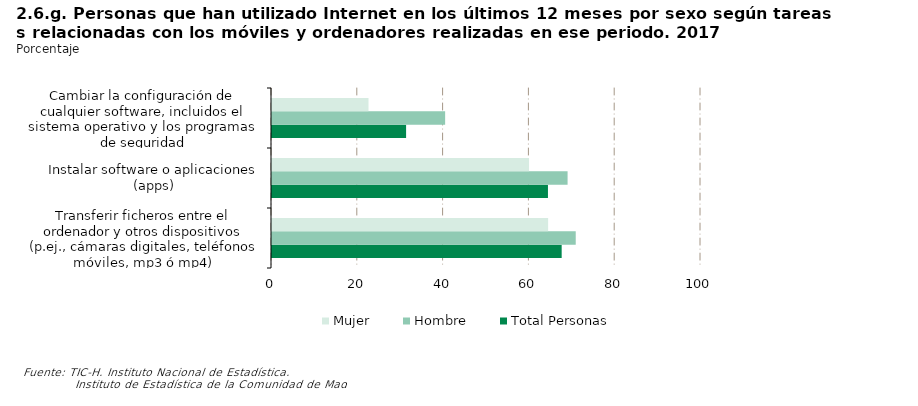
| Category | Total Personas | Hombre | Mujer |
|---|---|---|---|
| Transferir ficheros entre el ordenador y otros dispositivos (p.ej., cámaras digitales, teléfonos móviles, mp3 ó mp4) | 67.522 | 70.799 | 64.366 |
| Instalar software o aplicaciones (apps) | 64.325 | 68.9 | 59.92 |
| Cambiar la configuración de cualquier software, incluidos el sistema operativo y los programas de seguridad | 31.257 | 40.36 | 22.492 |